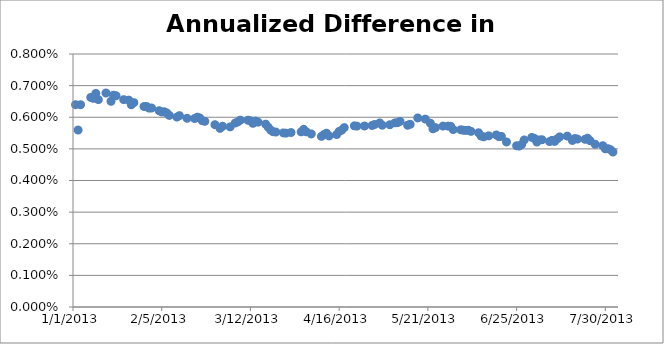
| Category | Annualized Difference in Returns |
|---|---|
| 41276.0 | 0.006 |
| 41277.0 | 0.006 |
| 41278.0 | 0.006 |
| 41282.0 | 0.007 |
| 41283.0 | 0.007 |
| 41284.0 | 0.007 |
| 41285.0 | 0.007 |
| 41288.0 | 0.007 |
| 41290.0 | 0.007 |
| 41291.0 | 0.007 |
| 41292.0 | 0.007 |
| 41295.0 | 0.007 |
| 41297.0 | 0.007 |
| 41298.0 | 0.006 |
| 41299.0 | 0.006 |
| 41303.0 | 0.006 |
| 41304.0 | 0.006 |
| 41305.0 | 0.006 |
| 41306.0 | 0.006 |
| 41309.0 | 0.006 |
| 41310.0 | 0.006 |
| 41311.0 | 0.006 |
| 41312.0 | 0.006 |
| 41313.0 | 0.006 |
| 41316.0 | 0.006 |
| 41317.0 | 0.006 |
| 41320.0 | 0.006 |
| 41323.0 | 0.006 |
| 41324.0 | 0.006 |
| 41325.0 | 0.006 |
| 41326.0 | 0.006 |
| 41327.0 | 0.006 |
| 41331.0 | 0.006 |
| 41333.0 | 0.006 |
| 41334.0 | 0.006 |
| 41337.0 | 0.006 |
| 41339.0 | 0.006 |
| 41340.0 | 0.006 |
| 41341.0 | 0.006 |
| 41344.0 | 0.006 |
| 41345.0 | 0.006 |
| 41346.0 | 0.006 |
| 41347.0 | 0.006 |
| 41348.0 | 0.006 |
| 41351.0 | 0.006 |
| 41352.0 | 0.006 |
| 41353.0 | 0.006 |
| 41354.0 | 0.006 |
| 41355.0 | 0.006 |
| 41358.0 | 0.006 |
| 41359.0 | 0.005 |
| 41361.0 | 0.006 |
| 41365.0 | 0.006 |
| 41366.0 | 0.006 |
| 41367.0 | 0.006 |
| 41369.0 | 0.005 |
| 41373.0 | 0.005 |
| 41374.0 | 0.005 |
| 41375.0 | 0.005 |
| 41376.0 | 0.005 |
| 41379.0 | 0.005 |
| 41380.0 | 0.006 |
| 41381.0 | 0.006 |
| 41382.0 | 0.006 |
| 41386.0 | 0.006 |
| 41387.0 | 0.006 |
| 41390.0 | 0.006 |
| 41393.0 | 0.006 |
| 41394.0 | 0.006 |
| 41396.0 | 0.006 |
| 41397.0 | 0.006 |
| 41400.0 | 0.006 |
| 41402.0 | 0.006 |
| 41403.0 | 0.006 |
| 41404.0 | 0.006 |
| 41407.0 | 0.006 |
| 41408.0 | 0.006 |
| 41411.0 | 0.006 |
| 41414.0 | 0.006 |
| 41416.0 | 0.006 |
| 41417.0 | 0.006 |
| 41418.0 | 0.006 |
| 41421.0 | 0.006 |
| 41423.0 | 0.006 |
| 41424.0 | 0.006 |
| 41425.0 | 0.006 |
| 41428.0 | 0.006 |
| 41429.0 | 0.006 |
| 41430.0 | 0.006 |
| 41431.0 | 0.006 |
| 41432.0 | 0.006 |
| 41435.0 | 0.006 |
| 41436.0 | 0.005 |
| 41437.0 | 0.005 |
| 41439.0 | 0.005 |
| 41442.0 | 0.005 |
| 41443.0 | 0.005 |
| 41444.0 | 0.005 |
| 41446.0 | 0.005 |
| 41450.0 | 0.005 |
| 41451.0 | 0.005 |
| 41452.0 | 0.005 |
| 41453.0 | 0.005 |
| 41456.0 | 0.005 |
| 41457.0 | 0.005 |
| 41458.0 | 0.005 |
| 41459.0 | 0.005 |
| 41460.0 | 0.005 |
| 41463.0 | 0.005 |
| 41464.0 | 0.005 |
| 41465.0 | 0.005 |
| 41466.0 | 0.005 |
| 41467.0 | 0.005 |
| 41470.0 | 0.005 |
| 41472.0 | 0.005 |
| 41473.0 | 0.005 |
| 41474.0 | 0.005 |
| 41477.0 | 0.005 |
| 41478.0 | 0.005 |
| 41479.0 | 0.005 |
| 41481.0 | 0.005 |
| 41484.0 | 0.005 |
| 41485.0 | 0.005 |
| 41486.0 | 0.005 |
| 41487.0 | 0.005 |
| 41488.0 | 0.005 |